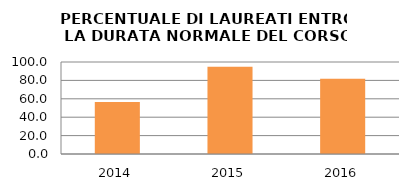
| Category | 2014 2015 2016 |
|---|---|
| 2014.0 | 56.522 |
| 2015.0 | 94.737 |
| 2016.0 | 81.818 |